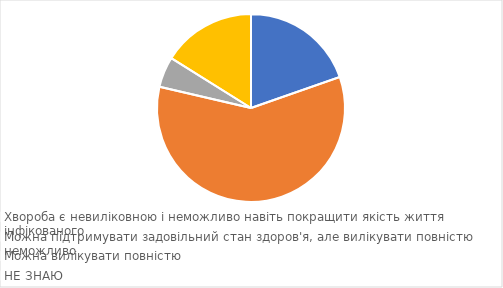
| Category | 25 років або старші |
|---|---|
| Хвороба є невиліковною і неможливо навіть покращити якість життя інфікованого | 0.196 |
| Можна підтримувати задовільний стан здоров'я, але вилікувати повністю неможливо | 0.59 |
| Можна вилікувати повністю | 0.052 |
| НЕ ЗНАЮ | 0.161 |